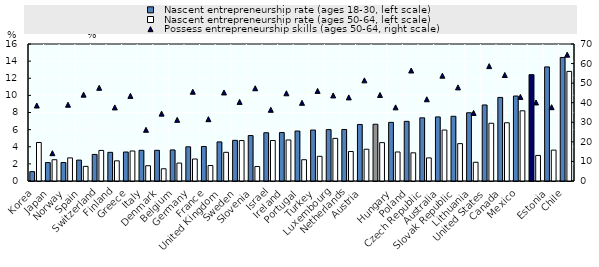
| Category |   Nascent entrepreneurship rate (ages 18-30, left scale) |   Nascent entrepreneurship rate (ages 50-64, left scale) |
|---|---|---|
| Korea | 1.093 | 4.495 |
| Japan | 2.152 | 2.487 |
| Norway | 2.158 | 2.697 |
| Spain | 2.439 | 1.709 |
| Switzerland | 3.102 | 3.569 |
| Finland | 3.348 | 2.354 |
| Greece | 3.384 | 3.503 |
| Italy | 3.582 | 1.784 |
| Denmark | 3.584 | 1.428 |
| Belgium | 3.627 | 2.093 |
| Germany | 3.994 | 2.569 |
| France | 4.032 | 1.81 |
| United Kingdom | 4.564 | 3.349 |
| Sweden | 4.75 | 4.724 |
| Slovenia | 5.307 | 1.69 |
| Israel | 5.636 | 4.728 |
| Ireland | 5.655 | 4.79 |
| Portugal | 5.837 | 2.486 |
| Turkey | 5.952 | 2.881 |
| Luxembourg | 6.001 | 4.976 |
| Netherlands | 6.015 | 3.446 |
| Austria | 6.603 | 3.708 |
|  | 6.628 | 4.48 |
| Hungary | 6.847 | 3.39 |
| Poland | 6.966 | 3.292 |
| Czech Republic | 7.377 | 2.699 |
| Australia | 7.482 | 5.954 |
| Slovak Republic | 7.558 | 4.366 |
| Lithuania | 7.972 | 2.187 |
| United States | 8.881 | 6.743 |
| Canada | 9.759 | 6.8 |
| Mexico | 9.924 | 8.199 |
|  | 12.418 | 2.987 |
| Estonia | 13.324 | 3.607 |
| Chile | 14.428 | 12.801 |